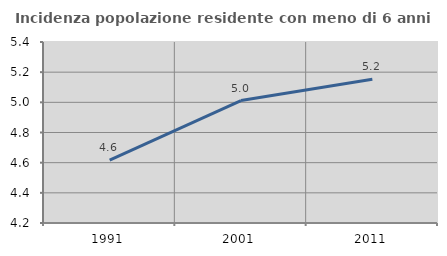
| Category | Incidenza popolazione residente con meno di 6 anni |
|---|---|
| 1991.0 | 4.616 |
| 2001.0 | 5.012 |
| 2011.0 | 5.153 |